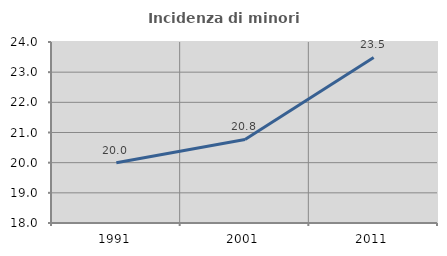
| Category | Incidenza di minori stranieri |
|---|---|
| 1991.0 | 20 |
| 2001.0 | 20.769 |
| 2011.0 | 23.486 |